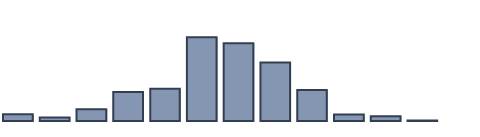
| Category | Series 0 |
|---|---|
| 0 | 1.972 |
| 1 | 1.017 |
| 2 | 3.392 |
| 3 | 8.353 |
| 4 | 9.328 |
| 5 | 24.256 |
| 6 | 22.478 |
| 7 | 16.91 |
| 8 | 8.958 |
| 9 | 1.873 |
| 10 | 1.344 |
| 11 | 0.118 |
| 12 | 0 |